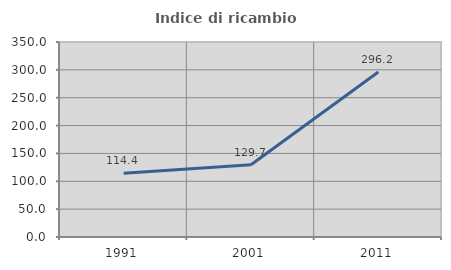
| Category | Indice di ricambio occupazionale  |
|---|---|
| 1991.0 | 114.376 |
| 2001.0 | 129.748 |
| 2011.0 | 296.218 |